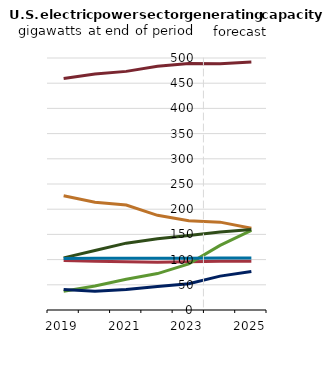
| Category | Nuclear | Coal | Natural gas | Solar | Other | Series 2 | Series 5 |
|---|---|---|---|---|---|---|---|
| 2019.0 | 98.119 | 226.809 | 459.516 | 37.029 | 40.859 | 103.453 | 102.262 |
| 2020.0 | 96.501 | 213.95 | 468.16 | 47.586 | 37.355 | 118.031 | 102.652 |
| 2021.0 | 95.546 | 208.326 | 473.459 | 61.009 | 40.72 | 132.629 | 102.618 |
| 2022.0 | 94.659 | 187.872 | 483.615 | 72.248 | 46.721 | 141.275 | 102.815 |
| 2023.0 | 95.773 | 177.152 | 489.133 | 91.622 | 52.111 | 147.628 | 102.828 |
| 2024.0 | 96.887 | 174.343 | 488.522 | 128.217 | 67.246 | 154.894 | 102.956 |
| 2025.0 | 96.932 | 162.214 | 492.013 | 158.172 | 76.398 | 159.952 | 103.027 |